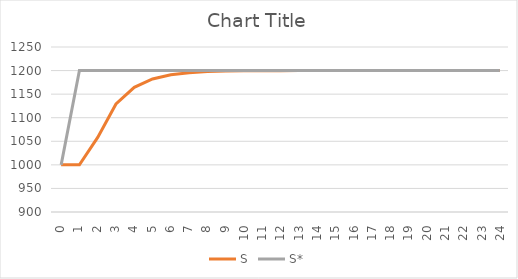
| Category | S | S* |
|---|---|---|
| 0.0 | 1000 | 1000 |
| 1.0 | 1000 | 1200 |
| 2.0 | 1058.333 | 1200 |
| 3.0 | 1129.167 | 1200 |
| 4.0 | 1164.583 | 1200 |
| 5.0 | 1182.292 | 1200 |
| 6.0 | 1191.146 | 1200 |
| 7.0 | 1195.573 | 1200 |
| 8.0 | 1197.786 | 1200 |
| 9.0 | 1198.893 | 1200 |
| 10.0 | 1199.447 | 1200 |
| 11.0 | 1199.723 | 1200 |
| 12.0 | 1199.862 | 1200 |
| 13.0 | 1199.931 | 1200 |
| 14.0 | 1199.965 | 1200 |
| 15.0 | 1199.983 | 1200 |
| 16.0 | 1199.991 | 1200 |
| 17.0 | 1199.996 | 1200 |
| 18.0 | 1199.998 | 1200 |
| 19.0 | 1199.999 | 1200 |
| 20.0 | 1199.999 | 1200 |
| 21.0 | 1200 | 1200 |
| 22.0 | 1200 | 1200 |
| 23.0 | 1200 | 1200 |
| 24.0 | 1200 | 1200 |